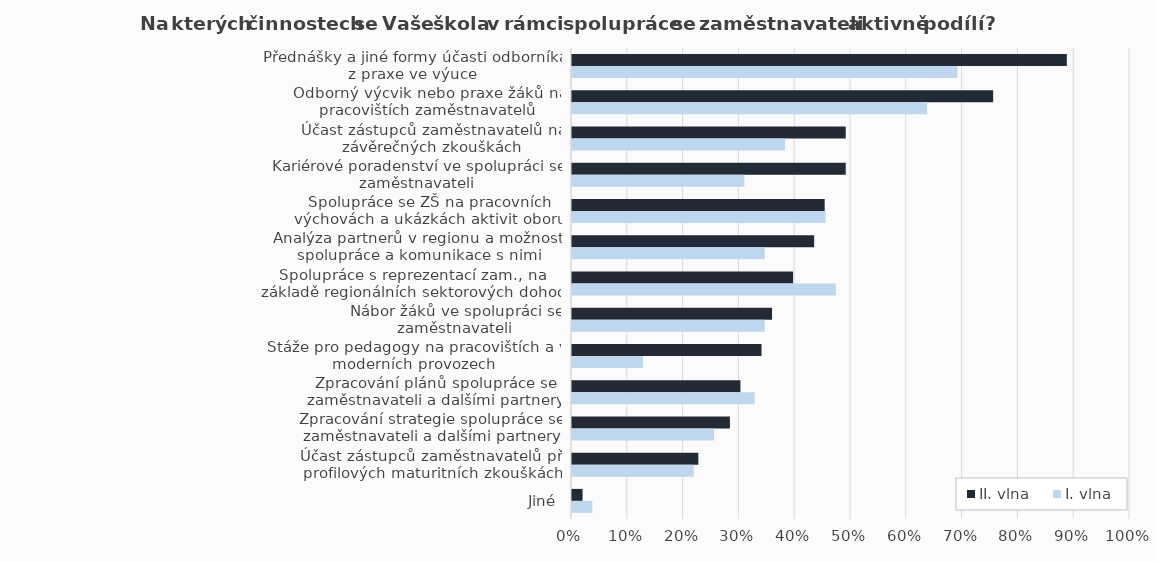
| Category | II. vlna | I. vlna |
|---|---|---|
| Přednášky a jiné formy účasti odborníka z praxe ve výuce | 0.887 | 0.691 |
| Odborný výcvik nebo praxe žáků na pracovištích zaměstnavatelů | 0.755 | 0.636 |
| Účast zástupců zaměstnavatelů na závěrečných zkouškách | 0.491 | 0.382 |
| Kariérové poradenství ve spolupráci se zaměstnavateli | 0.491 | 0.309 |
| Spolupráce se ZŠ na pracovních výchovách a ukázkách aktivit oboru | 0.453 | 0.455 |
| Analýza partnerů v regionu a možností spolupráce a komunikace s nimi | 0.434 | 0.345 |
| Spolupráce s reprezentací zam., na základě regionálních sektorových dohod | 0.396 | 0.473 |
| Nábor žáků ve spolupráci se zaměstnavateli | 0.358 | 0.345 |
| Stáže pro pedagogy na pracovištích a v moderních provozech | 0.34 | 0.127 |
| Zpracování plánů spolupráce se zaměstnavateli a dalšími partnery | 0.302 | 0.327 |
| Zpracování strategie spolupráce se zaměstnavateli a dalšími partnery | 0.283 | 0.255 |
| Účast zástupců zaměstnavatelů při profilových maturitních zkouškách | 0.226 | 0.218 |
| Jiné | 0.019 | 0.036 |